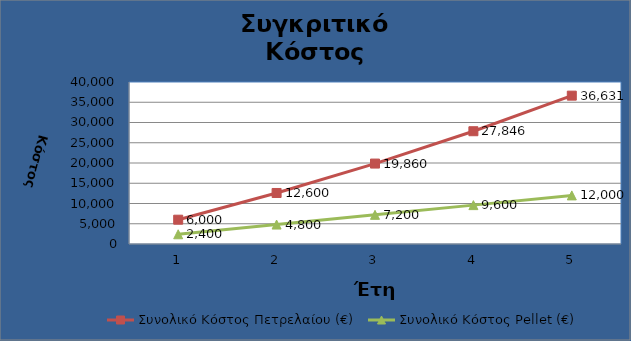
| Category | Συνολικό Κόστος Πετρελαίου (€) | Συνολικό Κόστος Pellet (€) |
|---|---|---|
| 0 | 6000 | 2400 |
| 1 | 12600 | 4800 |
| 2 | 19860 | 7200 |
| 3 | 27846 | 9600 |
| 4 | 36630.6 | 12000 |